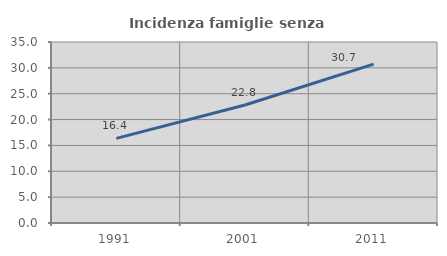
| Category | Incidenza famiglie senza nuclei |
|---|---|
| 1991.0 | 16.37 |
| 2001.0 | 22.818 |
| 2011.0 | 30.727 |